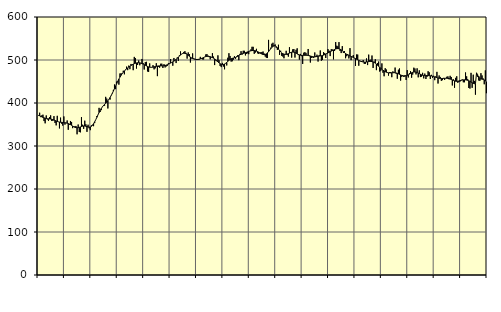
| Category | Piggar | Series 1 |
|---|---|---|
| nan | 370.1 | 371.12 |
| 87.0 | 377.4 | 370.32 |
| 87.0 | 367.1 | 369.15 |
| 87.0 | 371.3 | 367.78 |
| 87.0 | 372.8 | 366.56 |
| 87.0 | 358 | 365.42 |
| 87.0 | 352.7 | 364.63 |
| 87.0 | 371.1 | 363.93 |
| 87.0 | 361.8 | 363.42 |
| 87.0 | 358.6 | 363.16 |
| 87.0 | 367.3 | 362.91 |
| 87.0 | 371.3 | 362.63 |
| nan | 358.3 | 362.14 |
| 88.0 | 358.7 | 361.4 |
| 88.0 | 369.5 | 360.4 |
| 88.0 | 353.5 | 359.23 |
| 88.0 | 348 | 358.07 |
| 88.0 | 370.2 | 357.08 |
| 88.0 | 356.4 | 356.33 |
| 88.0 | 340.9 | 355.74 |
| 88.0 | 366 | 355.29 |
| 88.0 | 351.9 | 354.98 |
| 88.0 | 347.4 | 354.73 |
| 88.0 | 368.8 | 354.41 |
| nan | 349.7 | 354.06 |
| 89.0 | 354 | 353.61 |
| 89.0 | 359.4 | 353.01 |
| 89.0 | 337.7 | 352.24 |
| 89.0 | 349.5 | 351.19 |
| 89.0 | 358.2 | 349.8 |
| 89.0 | 355.9 | 348.15 |
| 89.0 | 341.5 | 346.43 |
| 89.0 | 345.2 | 344.82 |
| 89.0 | 345.8 | 343.51 |
| 89.0 | 346.6 | 342.68 |
| 89.0 | 327.2 | 342.39 |
| nan | 350 | 342.62 |
| 90.0 | 332.6 | 343.31 |
| 90.0 | 331.7 | 344.26 |
| 90.0 | 367.2 | 345.27 |
| 90.0 | 349.5 | 346.14 |
| 90.0 | 339.8 | 346.59 |
| 90.0 | 358.9 | 346.49 |
| 90.0 | 350.5 | 345.92 |
| 90.0 | 332.9 | 345.07 |
| 90.0 | 349.5 | 344.22 |
| 90.0 | 341.1 | 343.79 |
| 90.0 | 336.8 | 344.16 |
| nan | 348.3 | 345.62 |
| 91.0 | 349.2 | 348.22 |
| 91.0 | 346.1 | 351.88 |
| 91.0 | 353.3 | 356.32 |
| 91.0 | 361.3 | 361.34 |
| 91.0 | 369.7 | 366.8 |
| 91.0 | 372.2 | 372.4 |
| 91.0 | 388.7 | 377.8 |
| 91.0 | 379.2 | 382.79 |
| 91.0 | 383.4 | 387.23 |
| 91.0 | 391.4 | 390.96 |
| 91.0 | 395.2 | 394.14 |
| nan | 393.7 | 396.91 |
| 92.0 | 414.3 | 399.49 |
| 92.0 | 410.2 | 402.24 |
| 92.0 | 387.3 | 405.33 |
| 92.0 | 408.4 | 408.84 |
| 92.0 | 408 | 412.82 |
| 92.0 | 418 | 417.29 |
| 92.0 | 421.4 | 422.28 |
| 92.0 | 430.5 | 427.7 |
| 92.0 | 443 | 433.45 |
| 92.0 | 432.3 | 439.34 |
| 92.0 | 449.8 | 445.12 |
| nan | 449.3 | 450.62 |
| 93.0 | 442.7 | 455.69 |
| 93.0 | 468.7 | 460.23 |
| 93.0 | 468.8 | 464.42 |
| 93.0 | 469.4 | 468.22 |
| 93.0 | 475.1 | 471.53 |
| 93.0 | 466.7 | 474.44 |
| 93.0 | 478.1 | 477.04 |
| 93.0 | 484.6 | 479.38 |
| 93.0 | 476.4 | 481.51 |
| 93.0 | 487 | 483.51 |
| 93.0 | 478.6 | 485.4 |
| nan | 490.8 | 487.13 |
| 94.0 | 489.2 | 488.79 |
| 94.0 | 476.3 | 490.31 |
| 94.0 | 507.2 | 491.49 |
| 94.0 | 504.4 | 492.42 |
| 94.0 | 480.1 | 493.14 |
| 94.0 | 488.6 | 493.58 |
| 94.0 | 498.9 | 493.69 |
| 94.0 | 487.7 | 493.39 |
| 94.0 | 491.9 | 492.69 |
| 94.0 | 502.4 | 491.69 |
| 94.0 | 492.7 | 490.49 |
| nan | 477.9 | 489.14 |
| 95.0 | 495 | 487.71 |
| 95.0 | 495.8 | 486.32 |
| 95.0 | 473.4 | 485.09 |
| 95.0 | 472.3 | 484.01 |
| 95.0 | 492.1 | 483.25 |
| 95.0 | 483.2 | 482.95 |
| 95.0 | 483.1 | 483.04 |
| 95.0 | 488 | 483.44 |
| 95.0 | 478.2 | 484.07 |
| 95.0 | 480.6 | 484.78 |
| 95.0 | 492.5 | 485.41 |
| nan | 462.5 | 485.92 |
| 96.0 | 484.3 | 486.22 |
| 96.0 | 482.2 | 486.27 |
| 96.0 | 491.3 | 486.27 |
| 96.0 | 491.4 | 486.34 |
| 96.0 | 481.4 | 486.49 |
| 96.0 | 490.3 | 486.78 |
| 96.0 | 482.7 | 487.29 |
| 96.0 | 484.9 | 488.08 |
| 96.0 | 486.3 | 489.1 |
| 96.0 | 492.7 | 490.28 |
| 96.0 | 490.9 | 491.53 |
| nan | 502.3 | 492.82 |
| 97.0 | 494.5 | 494.2 |
| 97.0 | 486.7 | 495.69 |
| 97.0 | 504.7 | 497.33 |
| 97.0 | 499.7 | 499.22 |
| 97.0 | 492.9 | 501.38 |
| 97.0 | 505.7 | 503.8 |
| 97.0 | 497.7 | 506.43 |
| 97.0 | 510.7 | 509.17 |
| 97.0 | 519.9 | 511.73 |
| 97.0 | 513.3 | 513.82 |
| 97.0 | 514.8 | 515.21 |
| nan | 518.7 | 515.78 |
| 98.0 | 520.5 | 515.49 |
| 98.0 | 516.6 | 514.48 |
| 98.0 | 503.2 | 512.9 |
| 98.0 | 517.6 | 510.9 |
| 98.0 | 513.7 | 508.75 |
| 98.0 | 494.1 | 506.72 |
| 98.0 | 503.7 | 504.96 |
| 98.0 | 515.3 | 503.58 |
| 98.0 | 503.8 | 502.51 |
| 98.0 | 502.7 | 501.75 |
| 98.0 | 500.3 | 501.31 |
| nan | 500.3 | 501.19 |
| 99.0 | 500.3 | 501.4 |
| 99.0 | 500.9 | 501.93 |
| 99.0 | 507.3 | 502.71 |
| 99.0 | 502.4 | 503.65 |
| 99.0 | 501.5 | 504.72 |
| 99.0 | 501.3 | 505.9 |
| 99.0 | 507 | 507.09 |
| 99.0 | 513 | 508.01 |
| 99.0 | 513.8 | 508.51 |
| 99.0 | 510 | 508.59 |
| 99.0 | 506.7 | 508.33 |
| nan | 501.5 | 507.73 |
| 0.0 | 505.9 | 506.81 |
| 0.0 | 515.9 | 505.63 |
| 0.0 | 507.9 | 504.19 |
| 0.0 | 488.2 | 502.5 |
| 0.0 | 498.8 | 500.56 |
| 0.0 | 497.1 | 498.32 |
| 0.0 | 510.8 | 495.87 |
| 0.0 | 499.7 | 493.45 |
| 0.0 | 486.1 | 491.37 |
| 0.0 | 483.5 | 489.93 |
| 0.0 | 493.3 | 489.32 |
| nan | 484.8 | 489.59 |
| 1.0 | 478.4 | 490.68 |
| 1.0 | 492.1 | 492.38 |
| 1.0 | 487.3 | 494.52 |
| 1.0 | 505.3 | 496.92 |
| 1.0 | 515.8 | 499.28 |
| 1.0 | 509.4 | 501.3 |
| 1.0 | 496.3 | 502.79 |
| 1.0 | 497 | 503.76 |
| 1.0 | 500.7 | 504.45 |
| 1.0 | 508.8 | 505.13 |
| 1.0 | 503 | 505.97 |
| nan | 508.3 | 507.12 |
| 2.0 | 511.3 | 508.61 |
| 2.0 | 499.6 | 510.32 |
| 2.0 | 514.2 | 511.99 |
| 2.0 | 520.5 | 513.41 |
| 2.0 | 512.6 | 514.51 |
| 2.0 | 521.5 | 515.38 |
| 2.0 | 521.4 | 516.16 |
| 2.0 | 510.7 | 516.99 |
| 2.0 | 514.3 | 517.91 |
| 2.0 | 515.5 | 518.89 |
| 2.0 | 513.5 | 519.86 |
| nan | 521.2 | 520.76 |
| 3.0 | 524.7 | 521.47 |
| 3.0 | 530.7 | 521.93 |
| 3.0 | 530.6 | 522.11 |
| 3.0 | 514.4 | 521.97 |
| 3.0 | 517.3 | 521.51 |
| 3.0 | 526 | 520.73 |
| 3.0 | 515.6 | 519.62 |
| 3.0 | 514.3 | 518.25 |
| 3.0 | 515.6 | 516.73 |
| 3.0 | 518 | 515.19 |
| 3.0 | 518.7 | 513.83 |
| nan | 519.7 | 512.87 |
| 4.0 | 515.1 | 512.53 |
| 4.0 | 507.9 | 512.99 |
| 4.0 | 505.2 | 514.28 |
| 4.0 | 504.6 | 516.49 |
| 4.0 | 546.8 | 519.47 |
| 4.0 | 523.2 | 522.86 |
| 4.0 | 528.7 | 526.29 |
| 4.0 | 537.8 | 529.41 |
| 4.0 | 540.1 | 531.77 |
| 4.0 | 534.2 | 532.94 |
| 4.0 | 536.1 | 532.72 |
| nan | 528.4 | 531.21 |
| 5.0 | 523.6 | 528.59 |
| 5.0 | 535.5 | 525.31 |
| 5.0 | 512 | 521.95 |
| 5.0 | 521.5 | 518.89 |
| 5.0 | 509.6 | 516.38 |
| 5.0 | 508 | 514.6 |
| 5.0 | 504 | 513.56 |
| 5.0 | 513.6 | 513.15 |
| 5.0 | 521.4 | 513.29 |
| 5.0 | 511.5 | 513.92 |
| 5.0 | 507.8 | 514.91 |
| nan | 529.7 | 516.05 |
| 6.0 | 516.3 | 517.19 |
| 6.0 | 505.5 | 518.07 |
| 6.0 | 524.8 | 518.43 |
| 6.0 | 525.5 | 518.18 |
| 6.0 | 505.7 | 517.34 |
| 6.0 | 523.7 | 516.02 |
| 6.0 | 527.2 | 514.5 |
| 6.0 | 511.4 | 513.07 |
| 6.0 | 500.9 | 511.91 |
| 6.0 | 514.2 | 511.13 |
| 6.0 | 509 | 510.79 |
| nan | 490.8 | 510.73 |
| 7.0 | 516.9 | 510.81 |
| 7.0 | 518.2 | 510.94 |
| 7.0 | 516.6 | 511.07 |
| 7.0 | 510.6 | 511.02 |
| 7.0 | 525.6 | 510.68 |
| 7.0 | 509 | 510.1 |
| 7.0 | 494.1 | 509.33 |
| 7.0 | 505.1 | 508.52 |
| 7.0 | 506 | 507.85 |
| 7.0 | 504.6 | 507.48 |
| 7.0 | 517.5 | 507.44 |
| nan | 509.2 | 507.69 |
| 8.0 | 512.3 | 508.13 |
| 8.0 | 496.4 | 508.61 |
| 8.0 | 511.3 | 509.08 |
| 8.0 | 522.2 | 509.51 |
| 8.0 | 498.3 | 509.95 |
| 8.0 | 500.1 | 510.52 |
| 8.0 | 518.4 | 511.34 |
| 8.0 | 516 | 512.49 |
| 8.0 | 504.6 | 513.83 |
| 8.0 | 514.3 | 515.2 |
| 8.0 | 525.4 | 516.55 |
| nan | 521.6 | 517.9 |
| 9.0 | 509.1 | 519.26 |
| 9.0 | 525.2 | 520.64 |
| 9.0 | 524.4 | 522.01 |
| 9.0 | 501.5 | 523.32 |
| 9.0 | 520.9 | 524.54 |
| 9.0 | 541.7 | 525.6 |
| 9.0 | 533.2 | 526.36 |
| 9.0 | 531.8 | 526.54 |
| 9.0 | 541.6 | 526.13 |
| 9.0 | 520.9 | 525.15 |
| 9.0 | 516.1 | 523.58 |
| nan | 532.2 | 521.56 |
| 10.0 | 516.6 | 519.39 |
| 10.0 | 520.7 | 517.22 |
| 10.0 | 504.1 | 515.06 |
| 10.0 | 508.8 | 513.13 |
| 10.0 | 513.7 | 511.53 |
| 10.0 | 503.6 | 510.24 |
| 10.0 | 527.6 | 509.17 |
| 10.0 | 499.7 | 508.18 |
| 10.0 | 507.9 | 507.11 |
| 10.0 | 511.4 | 505.94 |
| 10.0 | 504.1 | 504.66 |
| nan | 486.3 | 503.28 |
| 11.0 | 512.8 | 501.82 |
| 11.0 | 512.6 | 500.4 |
| 11.0 | 486.7 | 499.06 |
| 11.0 | 497.5 | 497.83 |
| 11.0 | 497.6 | 496.79 |
| 11.0 | 496.3 | 496 |
| 11.0 | 499.9 | 495.43 |
| 11.0 | 490.9 | 495.14 |
| 11.0 | 491.2 | 495.2 |
| 11.0 | 503.7 | 495.44 |
| 11.0 | 488.2 | 495.83 |
| nan | 512.5 | 496.31 |
| 12.0 | 499.8 | 496.65 |
| 12.0 | 500.9 | 496.64 |
| 12.0 | 510.4 | 496.32 |
| 12.0 | 481.5 | 495.61 |
| 12.0 | 496.3 | 494.38 |
| 12.0 | 501.7 | 492.62 |
| 12.0 | 476.4 | 490.46 |
| 12.0 | 492.8 | 488.03 |
| 12.0 | 496.4 | 485.47 |
| 12.0 | 473.1 | 482.95 |
| 12.0 | 475.1 | 480.55 |
| nan | 492.1 | 478.36 |
| 13.0 | 470.4 | 476.33 |
| 13.0 | 462.2 | 474.45 |
| 13.0 | 480.9 | 472.87 |
| 13.0 | 477.9 | 471.63 |
| 13.0 | 470 | 470.73 |
| 13.0 | 463.7 | 470.16 |
| 13.0 | 471.7 | 469.94 |
| 13.0 | 472 | 470.02 |
| 13.0 | 460 | 470.2 |
| 13.0 | 473.6 | 470.38 |
| 13.0 | 470.8 | 470.5 |
| nan | 482.4 | 470.35 |
| 14.0 | 468 | 469.85 |
| 14.0 | 456.4 | 469.06 |
| 14.0 | 477.4 | 467.95 |
| 14.0 | 480.3 | 466.62 |
| 14.0 | 452.1 | 465.31 |
| 14.0 | 461 | 464.15 |
| 14.0 | 464.9 | 463.24 |
| 14.0 | 460.5 | 462.73 |
| 14.0 | 464.7 | 462.7 |
| 14.0 | 453.6 | 463.23 |
| 14.0 | 476.5 | 464.19 |
| nan | 459.4 | 465.52 |
| 15.0 | 469.3 | 467.09 |
| 15.0 | 474.2 | 468.74 |
| 15.0 | 458.8 | 470.25 |
| 15.0 | 466.1 | 471.34 |
| 15.0 | 482.1 | 471.99 |
| 15.0 | 480.2 | 472.22 |
| 15.0 | 466.5 | 471.88 |
| 15.0 | 480.6 | 470.98 |
| 15.0 | 459.7 | 469.71 |
| 15.0 | 475.9 | 468.24 |
| 15.0 | 460.3 | 466.79 |
| nan | 461.4 | 465.48 |
| 16.0 | 470.2 | 464.53 |
| 16.0 | 457.3 | 463.94 |
| 16.0 | 468.4 | 463.65 |
| 16.0 | 455.8 | 463.65 |
| 16.0 | 461 | 463.73 |
| 16.0 | 473.9 | 463.7 |
| 16.0 | 471.4 | 463.56 |
| 16.0 | 455.8 | 463.29 |
| 16.0 | 465.5 | 462.84 |
| 16.0 | 458.4 | 462.27 |
| 16.0 | 463.3 | 461.56 |
| nan | 453.1 | 460.77 |
| 17.0 | 461.9 | 459.9 |
| 17.0 | 472.4 | 459.02 |
| 17.0 | 445.3 | 458.24 |
| 17.0 | 464 | 457.57 |
| 17.0 | 460.6 | 457.16 |
| 17.0 | 451.5 | 456.97 |
| 17.0 | 453.1 | 457.01 |
| 17.0 | 458.3 | 457.22 |
| 17.0 | 453.7 | 457.45 |
| 17.0 | 457.1 | 457.58 |
| 17.0 | 461 | 457.53 |
| nan | 461.9 | 457.26 |
| 18.0 | 455.1 | 456.71 |
| 18.0 | 463.2 | 455.85 |
| 18.0 | 460.5 | 454.78 |
| 18.0 | 440.8 | 453.69 |
| 18.0 | 455 | 452.54 |
| 18.0 | 435.4 | 451.49 |
| 18.0 | 458.5 | 450.69 |
| 18.0 | 462.2 | 450.37 |
| 18.0 | 446.9 | 450.62 |
| 18.0 | 448.8 | 451.26 |
| 18.0 | 449.9 | 452.11 |
| nan | 452 | 452.89 |
| 19.0 | 454.7 | 453.42 |
| 19.0 | 448.2 | 453.75 |
| 19.0 | 448.2 | 453.86 |
| 19.0 | 471 | 453.71 |
| 19.0 | 462 | 453.34 |
| 19.0 | 455.4 | 452.69 |
| 19.0 | 434.9 | 451.68 |
| 19.0 | 433.5 | 450.23 |
| 19.0 | 470.1 | 448.55 |
| 19.0 | 435.3 | 446.99 |
| 19.0 | 465.8 | 445.66 |
| nan | 451.4 | 444.85 |
| 20.0 | 419.4 | 444.64 |
| 20.0 | 470.3 | 470.03 |
| 20.0 | 465.9 | 461.54 |
| 20.0 | 452.4 | 462.11 |
| 20.0 | 451.5 | 455.76 |
| 20.0 | 469.3 | 455.82 |
| 20.0 | 464.1 | 455.55 |
| 20.0 | 457.1 | 454.86 |
| 20.0 | 443.6 | 453.6 |
| 20.0 | 475.8 | 451.72 |
| 20.0 | 422.8 | 449.43 |